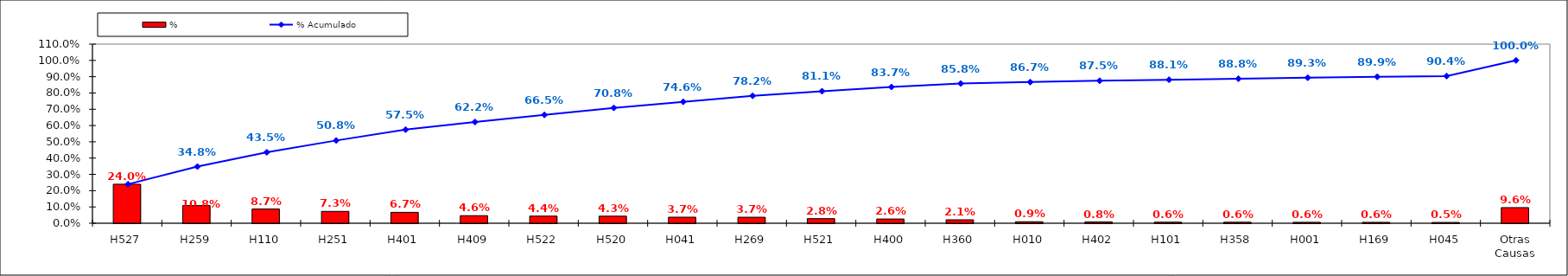
| Category | % |
|---|---|
| H527 | 0.24 |
| H259 | 0.108 |
| H110 | 0.087 |
| H251 | 0.073 |
| H401 | 0.067 |
| H409 | 0.046 |
| H522 | 0.044 |
| H520 | 0.043 |
| H041 | 0.037 |
| H269 | 0.037 |
| H521 | 0.028 |
| H400 | 0.026 |
| H360 | 0.021 |
| H010 | 0.009 |
| H402 | 0.008 |
| H101 | 0.006 |
| H358 | 0.006 |
| H001 | 0.006 |
| H169 | 0.006 |
| H045 | 0.005 |
| Otras Causas | 0.096 |